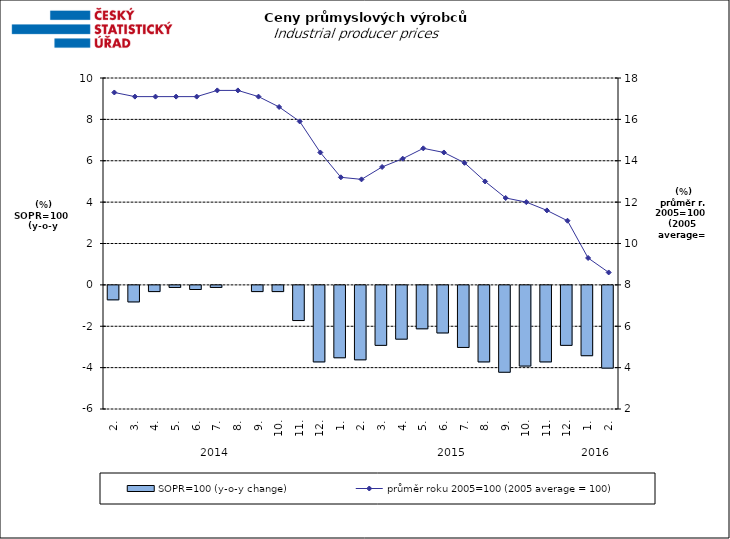
| Category | SOPR=100 (y-o-y change)   |
|---|---|
| 0 | -0.7 |
| 1 | -0.8 |
| 2 | -0.3 |
| 3 | -0.1 |
| 4 | -0.2 |
| 5 | -0.1 |
| 6 | 0 |
| 7 | -0.3 |
| 8 | -0.3 |
| 9 | -1.7 |
| 10 | -3.7 |
| 11 | -3.5 |
| 12 | -3.6 |
| 13 | -2.9 |
| 14 | -2.6 |
| 15 | -2.1 |
| 16 | -2.3 |
| 17 | -3 |
| 18 | -3.7 |
| 19 | -4.2 |
| 20 | -3.9 |
| 21 | -3.7 |
| 22 | -2.9 |
| 23 | -3.4 |
| 24 | -4 |